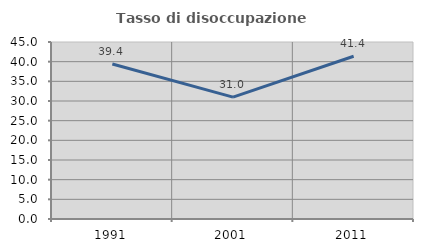
| Category | Tasso di disoccupazione giovanile  |
|---|---|
| 1991.0 | 39.42 |
| 2001.0 | 30.996 |
| 2011.0 | 41.379 |